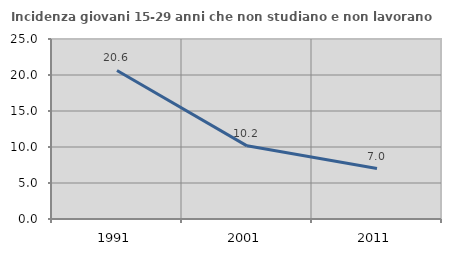
| Category | Incidenza giovani 15-29 anni che non studiano e non lavorano  |
|---|---|
| 1991.0 | 20.631 |
| 2001.0 | 10.162 |
| 2011.0 | 7.006 |